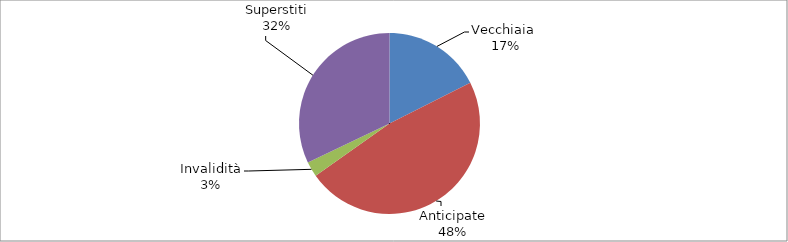
| Category | Series 0 |
|---|---|
| Vecchiaia  | 7544 |
| Anticipate | 20458 |
| Invalidità | 1169 |
| Superstiti | 13784 |